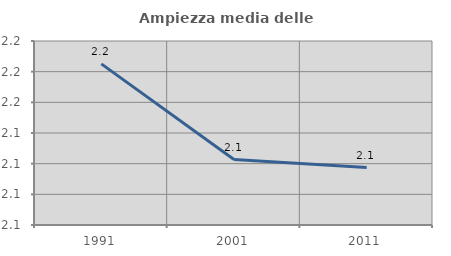
| Category | Ampiezza media delle famiglie |
|---|---|
| 1991.0 | 2.185 |
| 2001.0 | 2.123 |
| 2011.0 | 2.117 |